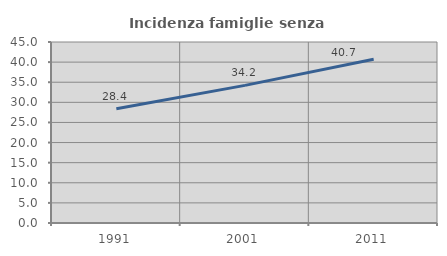
| Category | Incidenza famiglie senza nuclei |
|---|---|
| 1991.0 | 28.395 |
| 2001.0 | 34.221 |
| 2011.0 | 40.727 |